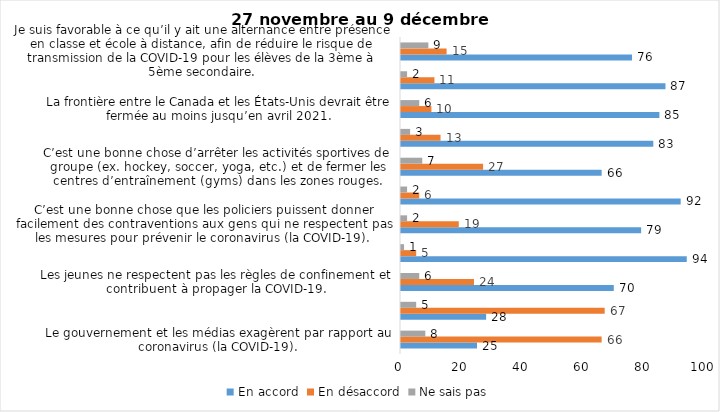
| Category | En accord | En désaccord | Ne sais pas |
|---|---|---|---|
| Le gouvernement et les médias exagèrent par rapport au coronavirus (la COVID-19). | 25 | 66 | 8 |
| Il est exagéré de rester chez soi pour se protéger contre le coronavirus (la COVID-19). | 28 | 67 | 5 |
| Les jeunes ne respectent pas les règles de confinement et contribuent à propager la COVID-19. | 70 | 24 | 6 |
| Je suis favorable à l’obligation de porter le masque ou le couvre-visage dans tous les lieux publics fermés (épiceries, magasins, restaurants, cinéma, lieux de culte, etc.). | 94 | 5 | 1 |
| C’est une bonne chose que les policiers puissent donner facilement des contraventions aux gens qui ne respectent pas les mesures pour prévenir le coronavirus (la COVID-19). | 79 | 19 | 2 |
| Je suis favorable à l’obligation de porter le masque ou le couvre-visage lors des manifestations citoyennes. | 92 | 6 | 2 |
| C’est une bonne chose d’arrêter les activités sportives de groupe (ex. hockey, soccer, yoga, etc.) et de fermer les centres d’entraînement (gyms) dans les zones rouges. | 66 | 27 | 7 |
| Je suis favorable à l’obligation de porter le masque ou le couvre-visage en tout temps pour les élèves au secondaire. | 83 | 13 | 3 |
| La frontière entre le Canada et les États-Unis devrait être fermée au moins jusqu’en avril 2021. | 85 | 10 | 6 |
| J’ai peur que le système de santé soit débordé par les cas de COVID-19 suite à la période des fêtes. | 87 | 11 | 2 |
| Je suis favorable à ce qu’il y ait une alternance entre présence en classe et école à distance, afin de réduire le risque de transmission de la COVID-19 pour les élèves de la 3ème à 5ème secondaire. | 76 | 15 | 9 |